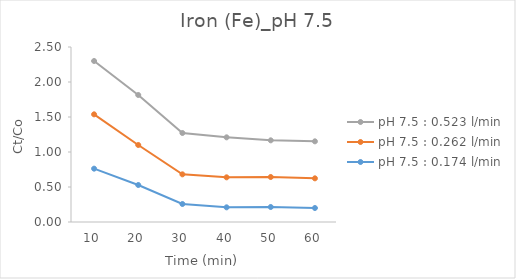
| Category | pH 7.5 : 0.174 l/min | pH 7.5 : 0.262 l/min | pH 7.5 : 0.523 l/min |
|---|---|---|---|
| 10.0 | 0.762 | 0.776 | 0.762 |
| 20.0 | 0.529 | 0.571 | 0.714 |
| 30.0 | 0.257 | 0.424 | 0.59 |
| 40.0 | 0.21 | 0.429 | 0.571 |
| 50.0 | 0.214 | 0.429 | 0.524 |
| 60.0 | 0.2 | 0.424 | 0.529 |